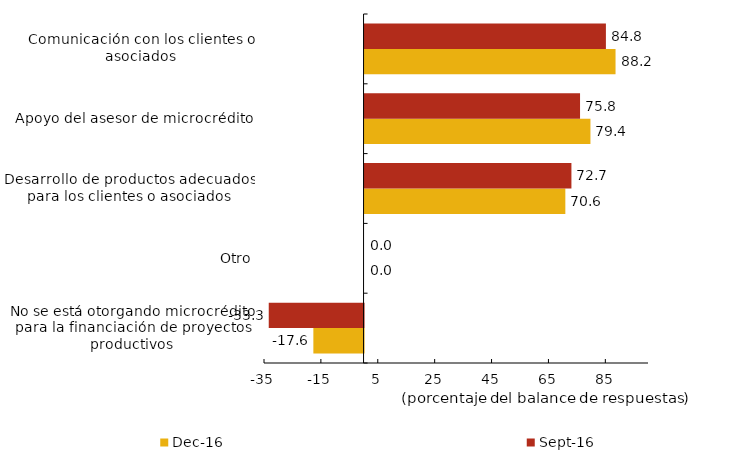
| Category | dic-16 | sep-16 |
|---|---|---|
| No se está otorgando microcrédito para la financiación de proyectos productivos | -17.647 | -33.333 |
| Otro | 0 | 0 |
| Desarrollo de productos adecuados para los clientes o asociados | 70.588 | 72.727 |
| Apoyo del asesor de microcrédito | 79.412 | 75.758 |
| Comunicación con los clientes o asociados | 88.235 | 84.848 |